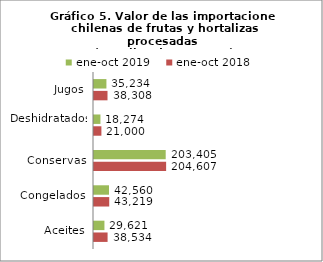
| Category | ene-oct 2018 | ene-oct 2019 |
|---|---|---|
| Aceites | 38534027.34 | 29621463.06 |
| Congelados | 43218639.91 | 42559797.16 |
| Conservas | 204607363.14 | 203404699.79 |
| Deshidratados | 20999685.3 | 18273613.75 |
| Jugos | 38308209.03 | 35234489.08 |